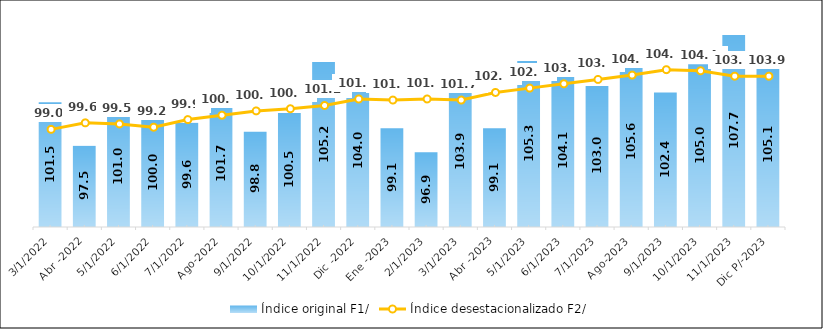
| Category |  Índice original F1/  |
|---|---|
| Mar -2022 | 101.5 |
| Abr -2022 | 97.5 |
| May-2022 | 101 |
| Jun-2022 | 100 |
| Jul -2022 | 99.6 |
| Ago-2022 | 101.7 |
| Sep -2022 | 98.8 |
| Oct -2022 | 100.5 |
| Nov-2022 | 105.2 |
| Dic -2022 | 104 |
| Ene -2023 | 99.1 |
| Feb-2023 | 96.9 |
| Mar -2023 | 103.9 |
| Abr -2023 | 99.1 |
| May -2023 | 105.3 |
| Jun-2023 | 104.1 |
| Jul-2023 | 103 |
| Ago-2023 | 105.6 |
| Sep -2023 | 102.4 |
| Oct -2023 | 105 |
| Nov-2023 | 107.7 |
| Dic P/-2023 | 105.1 |